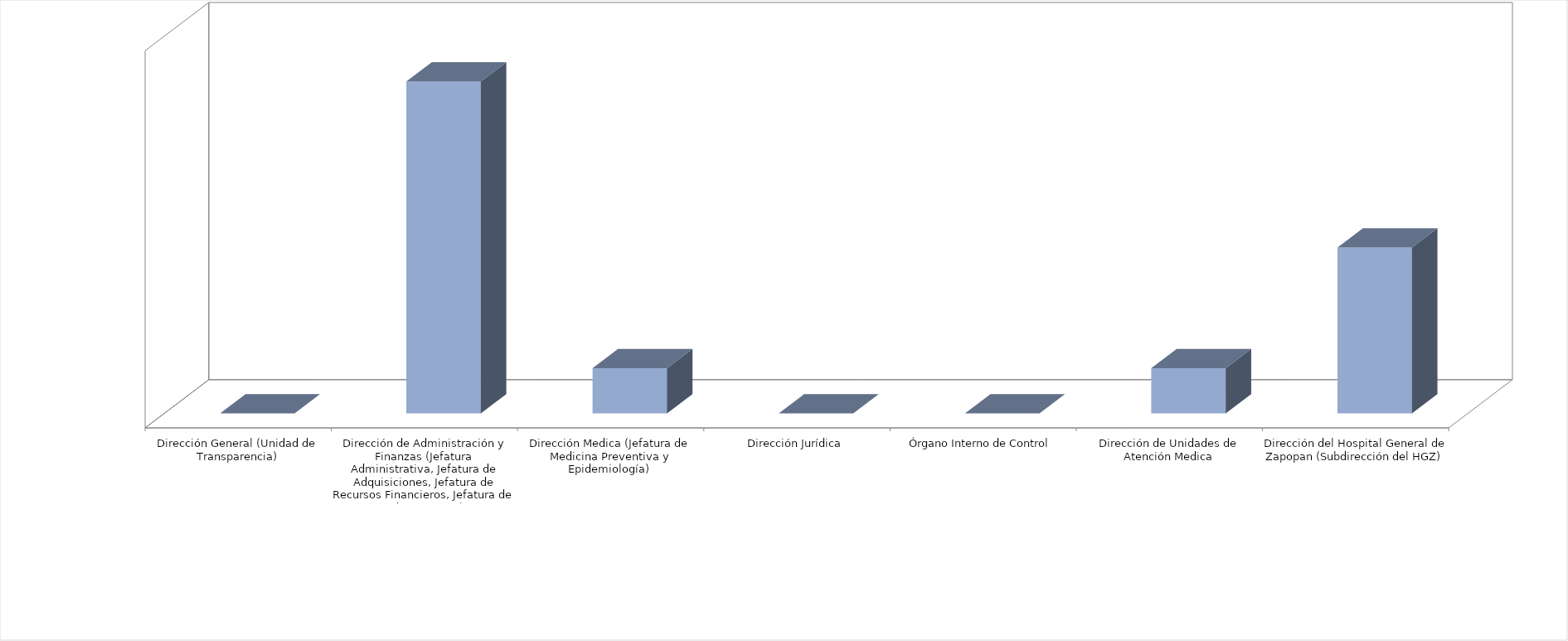
| Category | Series 0 | Series 1 |
|---|---|---|
| Dirección General (Unidad de Transparencia) |  | 0 |
| Dirección de Administración y Finanzas (Jefatura Administrativa, Jefatura de Adquisiciones, Jefatura de Recursos Financieros, Jefatura de Adquisiciones) |  | 22 |
| Dirección Medica (Jefatura de Medicina Preventiva y Epidemiología)  |  | 3 |
| Dirección Jurídica |  | 0 |
| Órgano Interno de Control |  | 0 |
| Dirección de Unidades de Atención Medica |  | 3 |
| Dirección del Hospital General de Zapopan (Subdirección del HGZ) |  | 11 |